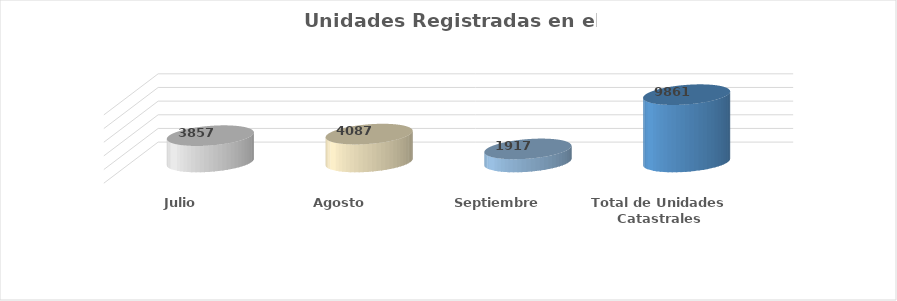
| Category | Series 0 |
|---|---|
| Julio | 3857 |
| Agosto | 4087 |
| Septiembre | 1917 |
| Total de Unidades Catastrales Incorporadas en el Trimestre | 9861 |